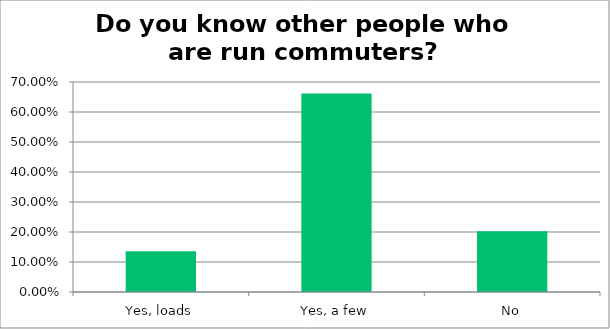
| Category | Responses |
|---|---|
| Yes, loads | 0.136 |
| Yes, a few | 0.662 |
| No | 0.202 |